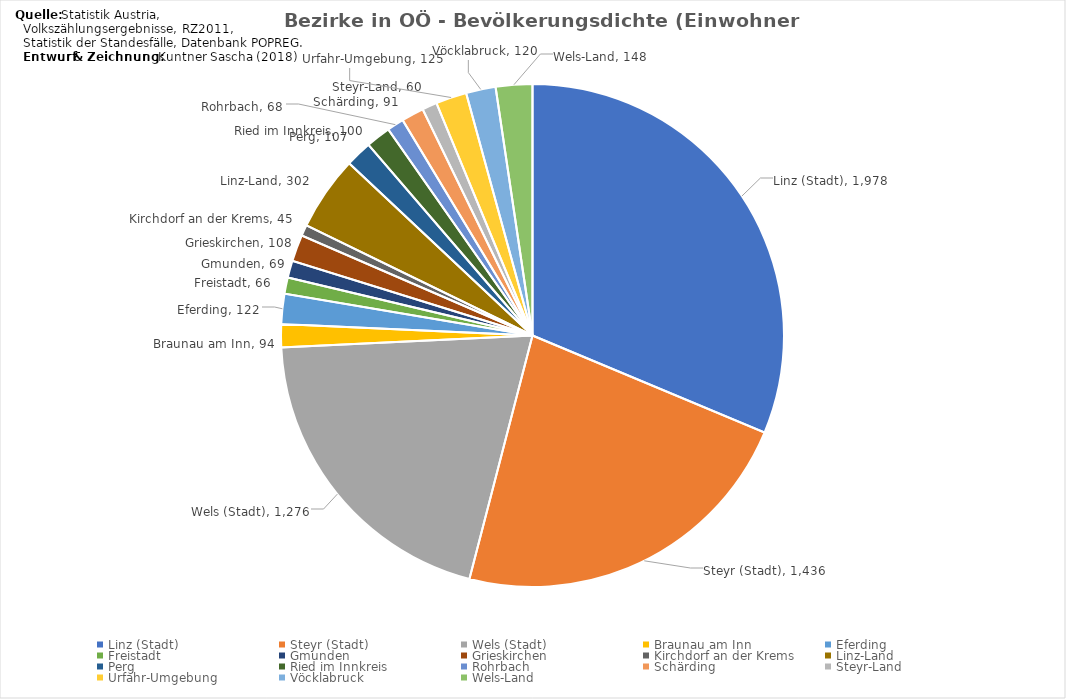
| Category | Dichte (Einwohner pro km²) |
|---|---|
| Linz (Stadt) | 1978.01 |
| Steyr (Stadt) | 1436.278 |
| Wels (Stadt) | 1276.492 |
| Braunau am Inn | 94.063 |
| Eferding | 122.316 |
| Freistadt | 65.513 |
| Gmunden | 69.367 |
| Grieskirchen | 108.04 |
| Kirchdorf an der Krems | 44.804 |
| Linz-Land | 302.229 |
| Perg | 107.205 |
| Ried im Innkreis | 100.091 |
| Rohrbach | 68.464 |
| Schärding | 91.23 |
| Steyr-Land | 60.41 |
| Urfahr-Umgebung | 125.366 |
| Vöcklabruck | 120.218 |
| Wels-Land | 148.449 |